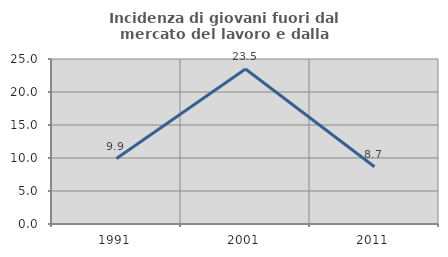
| Category | Incidenza di giovani fuori dal mercato del lavoro e dalla formazione  |
|---|---|
| 1991.0 | 9.917 |
| 2001.0 | 23.492 |
| 2011.0 | 8.664 |